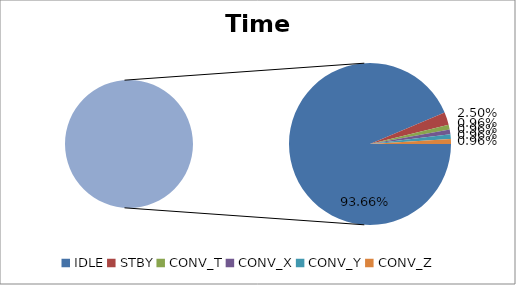
| Category | Series 1 | Series 0 |
|---|---|---|
| IDLE | 18.732 | 18.732 |
| STBY | 0.5 | 0.5 |
| CONV_T | 0.192 | 0.192 |
| CONV_X | 0.192 | 0.192 |
| CONV_Y | 0.192 | 0.192 |
| CONV_Z | 0.192 | 0.192 |